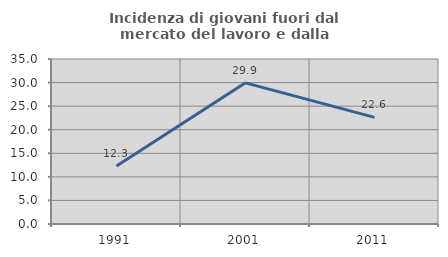
| Category | Incidenza di giovani fuori dal mercato del lavoro e dalla formazione  |
|---|---|
| 1991.0 | 12.301 |
| 2001.0 | 29.938 |
| 2011.0 | 22.628 |